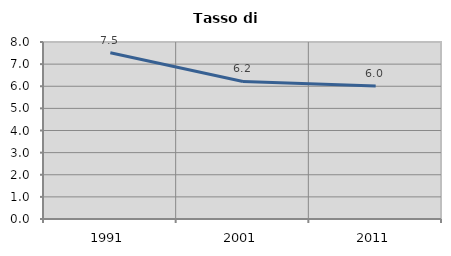
| Category | Tasso di disoccupazione   |
|---|---|
| 1991.0 | 7.512 |
| 2001.0 | 6.218 |
| 2011.0 | 6.011 |